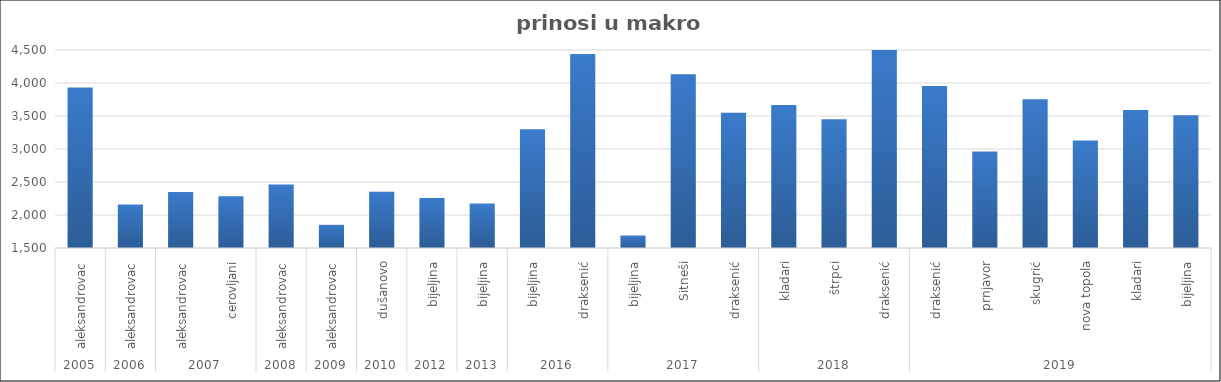
| Category | Series 0 |
|---|---|
| 0 | 3933.625 |
| 1 | 2159.792 |
| 2 | 2347.117 |
| 3 | 2284.533 |
| 4 | 2463.285 |
| 5 | 1850.476 |
| 6 | 2350.762 |
| 7 | 2258.182 |
| 8 | 2175.565 |
| 9 | 3299.917 |
| 10 | 4439.25 |
| 11 | 1689.5 |
| 12 | 4133.125 |
| 13 | 3549.625 |
| 14 | 3667 |
| 15 | 3451 |
| 16 | 4607 |
| 17 | 3954 |
| 18 | 2963 |
| 19 | 3754 |
| 20 | 3130 |
| 21 | 3592 |
| 22 | 3512 |